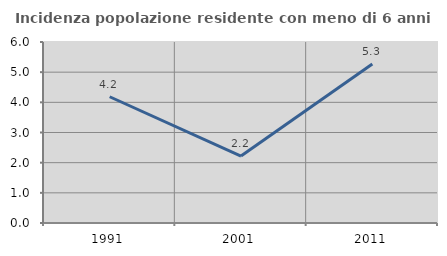
| Category | Incidenza popolazione residente con meno di 6 anni |
|---|---|
| 1991.0 | 4.185 |
| 2001.0 | 2.218 |
| 2011.0 | 5.273 |